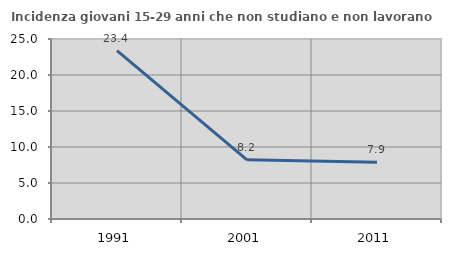
| Category | Incidenza giovani 15-29 anni che non studiano e non lavorano  |
|---|---|
| 1991.0 | 23.377 |
| 2001.0 | 8.221 |
| 2011.0 | 7.883 |